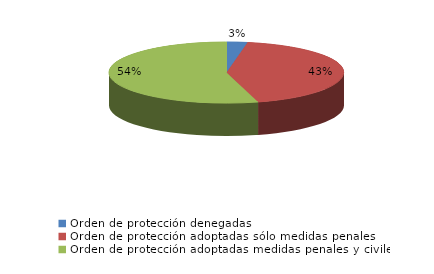
| Category | Series 0 |
|---|---|
| Orden de protección denegadas | 39 |
| Orden de protección adoptadas sólo medidas penales | 584 |
| Orden de protección adoptadas medidas penales y civiles | 741 |